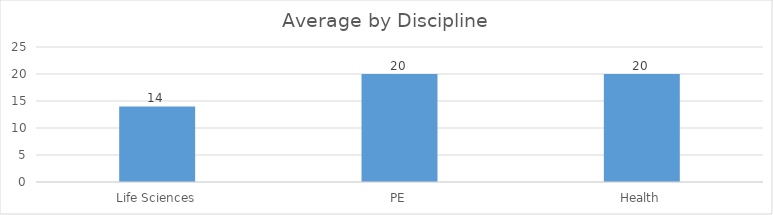
| Category | Total Average Score |
|---|---|
| Life Sciences | 14 |
| PE | 20 |
| Health | 20 |